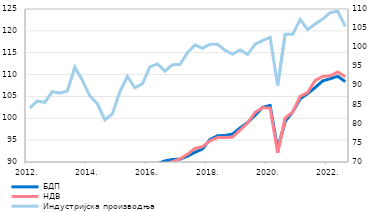
| Category | БДП | НДВ |
|---|---|---|
| 2012. | 84.018 | 84.612 |
| II | 85.258 | 85.96 |
| III | 84.302 | 84.992 |
| IV | 84.116 | 85.358 |
| 2013. | 86.02 | 86.217 |
| II | 86.175 | 86.066 |
| III | 87.892 | 88.326 |
| IV | 87.218 | 87.438 |
| 2014. | 86.152 | 85.98 |
| II | 85.484 | 85.23 |
| III | 84.559 | 84.096 |
| IV | 85.868 | 85.308 |
| 2015. | 86.262 | 86.126 |
| II | 87.023 | 87.171 |
| III | 86.897 | 87.198 |
| IV | 87.886 | 88.099 |
| 2016. | 89.166 | 88.801 |
| II | 89.646 | 89.152 |
| III | 90.249 | 89.415 |
| IV | 90.577 | 90.087 |
| 2017. | 90.641 | 90.715 |
| II | 91.332 | 91.781 |
| III | 92.227 | 93.099 |
| IV | 92.975 | 93.517 |
| 2018. | 95.156 | 94.822 |
| II | 95.991 | 95.589 |
| III | 96.075 | 95.614 |
| IV | 96.399 | 95.689 |
| 2019. | 97.791 | 97.306 |
| II | 99.022 | 98.94 |
| III | 100.682 | 101.344 |
| IV | 102.505 | 102.41 |
| 2020. | 102.935 | 102.319 |
| II | 92.928 | 92.115 |
| III | 99.313 | 100.067 |
| IV | 101.448 | 101.436 |
| 2021. | 104.465 | 105.028 |
| II | 105.666 | 105.913 |
| III | 107.038 | 108.676 |
| IV | 108.563 | 109.568 |
| 2022. | 109.057 | 109.723 |
| II | 109.608 | 110.591 |
| III | 108.382 | 109.482 |